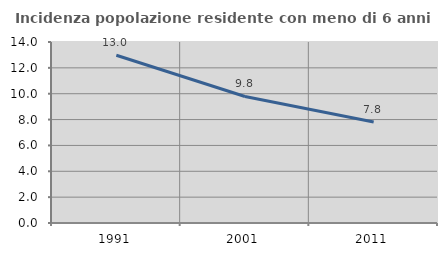
| Category | Incidenza popolazione residente con meno di 6 anni |
|---|---|
| 1991.0 | 12.972 |
| 2001.0 | 9.785 |
| 2011.0 | 7.807 |